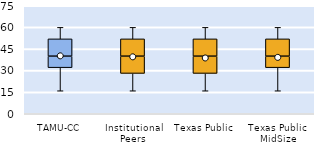
| Category | 25th | 50th | 75th |
|---|---|---|---|
| TAMU-CC | 32 | 8 | 12 |
| Institutional Peers | 28 | 12 | 12 |
| Texas Public | 28 | 12 | 12 |
| Texas Public MidSize | 32 | 8 | 12 |